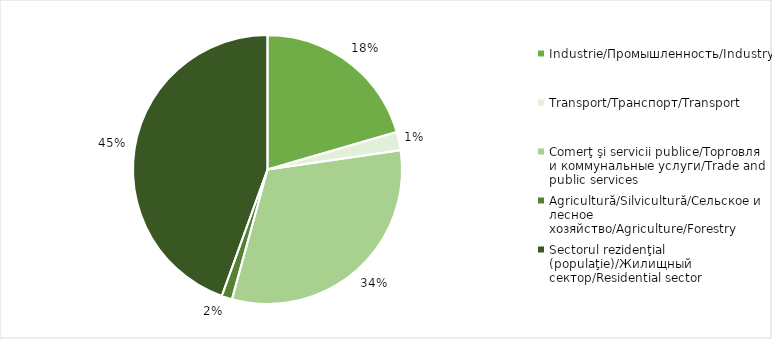
| Category | Series 0 |
|---|---|
| Industrie/Промышленность/Industry | 65 |
| Transport/Транспорт/Transport | 7 |
| Comerţ şi servicii publice/Торговля и коммунальные услуги/Trade and public services  | 100 |
| Agricultură/Silvicultură/Сельское и лесное хозяйство/Agriculture/Forestry  | 4 |
| Sectorul rezidenţial (populaţie)/Жилищный сектор/Residential sector     | 141 |